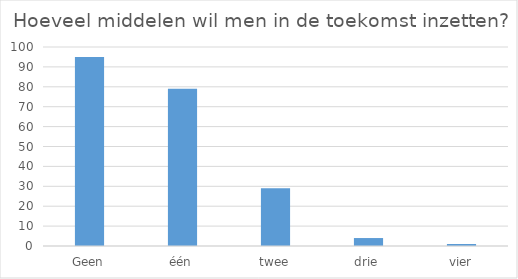
| Category | Series 0 |
|---|---|
| Geen | 95 |
| één | 79 |
| twee | 29 |
| drie | 4 |
| vier | 1 |